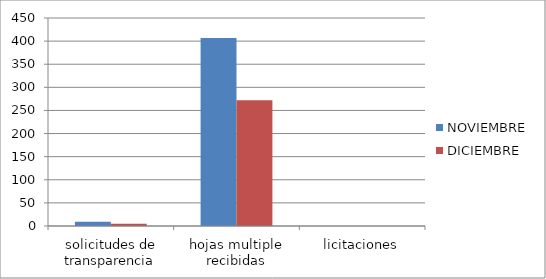
| Category | NOVIEMBRE | DICIEMBRE |
|---|---|---|
| solicitudes de transparencia | 9 | 5 |
| hojas multiple recibidas | 407 | 272 |
| licitaciones | 0 | 0 |